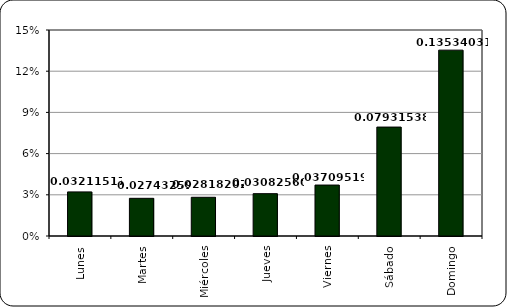
| Category | Series 1 |
|---|---|
| Lunes | 0.032 |
| Martes | 0.027 |
| Miércoles | 0.028 |
| Jueves | 0.031 |
| Viernes | 0.037 |
| Sábado | 0.079 |
| Domingo | 0.135 |